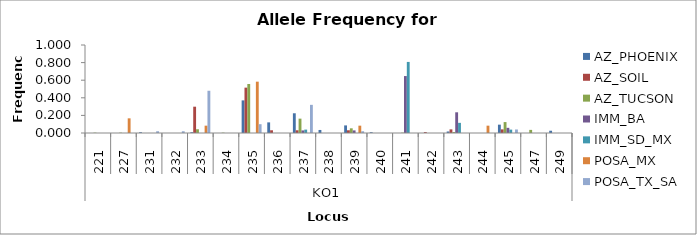
| Category | AZ_PHOENIX | AZ_SOIL | AZ_TUCSON | IMM_BA | IMM_SD_MX | POSA_MX | POSA_TX_SA |
|---|---|---|---|---|---|---|---|
| 0 | 0 | 0 | 0.004 | 0 | 0 | 0 | 0 |
| 1 | 0 | 0 | 0.004 | 0 | 0 | 0.167 | 0 |
| 2 | 0.009 | 0 | 0 | 0 | 0 | 0 | 0.02 |
| 3 | 0 | 0 | 0 | 0 | 0 | 0 | 0.02 |
| 4 | 0.009 | 0.299 | 0.043 | 0 | 0 | 0.083 | 0.48 |
| 5 | 0 | 0 | 0.004 | 0 | 0 | 0 | 0 |
| 6 | 0.371 | 0.515 | 0.557 | 0 | 0 | 0.583 | 0.1 |
| 7 | 0.121 | 0.031 | 0 | 0 | 0 | 0 | 0 |
| 8 | 0.224 | 0.031 | 0.163 | 0.029 | 0.038 | 0 | 0.32 |
| 9 | 0.034 | 0 | 0 | 0 | 0 | 0 | 0 |
| 10 | 0.086 | 0.031 | 0.053 | 0.029 | 0 | 0.083 | 0.02 |
| 11 | 0.009 | 0 | 0 | 0 | 0 | 0 | 0 |
| 12 | 0 | 0 | 0.004 | 0.647 | 0.808 | 0 | 0 |
| 13 | 0 | 0.01 | 0 | 0 | 0 | 0 | 0 |
| 14 | 0.017 | 0.041 | 0.011 | 0.235 | 0.115 | 0 | 0 |
| 15 | 0 | 0 | 0 | 0 | 0 | 0.083 | 0 |
| 16 | 0.095 | 0.041 | 0.124 | 0.059 | 0.038 | 0 | 0.04 |
| 17 | 0 | 0 | 0.035 | 0 | 0 | 0 | 0 |
| 18 | 0.026 | 0 | 0 | 0 | 0 | 0 | 0 |